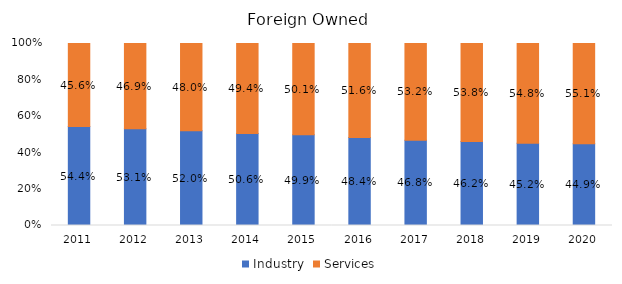
| Category | Industry | Services |
|---|---|---|
| 2011.0 | 0.544 | 0.456 |
| 2012.0 | 0.531 | 0.469 |
| 2013.0 | 0.52 | 0.48 |
| 2014.0 | 0.506 | 0.494 |
| 2015.0 | 0.499 | 0.501 |
| 2016.0 | 0.484 | 0.516 |
| 2017.0 | 0.468 | 0.532 |
| 2018.0 | 0.462 | 0.538 |
| 2019.0 | 0.452 | 0.548 |
| 2020.0 | 0.449 | 0.551 |